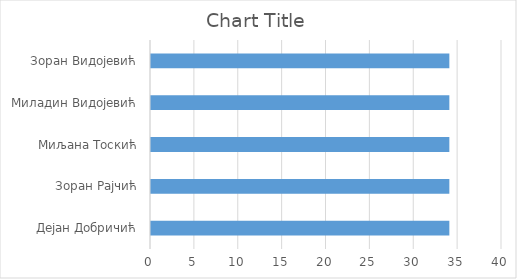
| Category | Series 0 |
|---|---|
| Дејан Добричић | 34 |
| Зоран Рајчић | 34 |
| Миљана Тоскић | 34 |
| Миладин Видојевић | 34 |
| Зоран Видојевић | 34 |